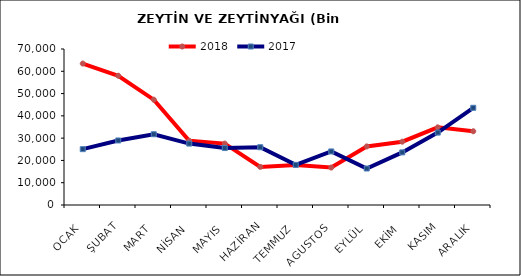
| Category | 2018 | 2017 |
|---|---|---|
| OCAK | 63470.139 | 25053.806 |
| ŞUBAT | 57999.799 | 28959.574 |
| MART | 47264.551 | 31758.513 |
| NİSAN | 28798.932 | 27550.556 |
| MAYIS | 27552.439 | 25553.173 |
| HAZİRAN | 17097.258 | 25930.345 |
| TEMMUZ | 17987.946 | 17993.176 |
| AGUSTOS | 16805.826 | 24031.04 |
| EYLÜL | 26288.062 | 16366.568 |
| EKİM | 28407.485 | 23613.367 |
| KASIM | 34843.242 | 32484.807 |
| ARALIK | 33082.407 | 43622.536 |